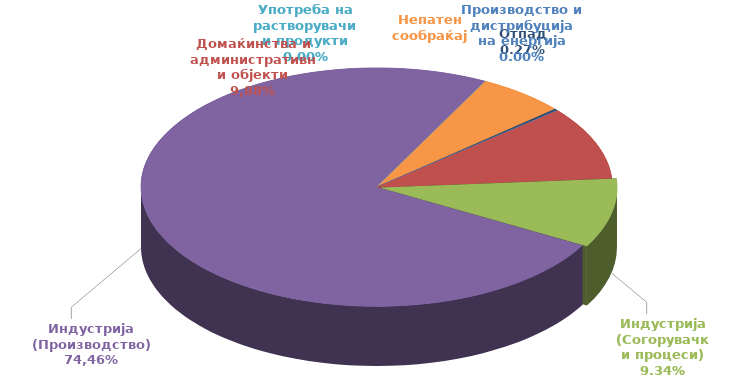
| Category | Series 0 |
|---|---|
| Производство и дистрибуција на енергија | 0 |
| Домаќинства и административни објекти | 0.099 |
| Индустрија (Согорувачки процеси) | 0.093 |
| Индустрија (Производство) | 0.745 |
| Употреба на растворувачи и продукти | 0 |
| Непатен сообраќај | 0.06 |
| Oтпад | 0.003 |